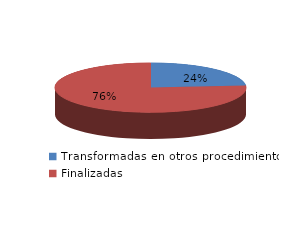
| Category | Series 0 |
|---|---|
| Transformadas en otros procedimientos | 2074 |
| Finalizadas | 6731 |